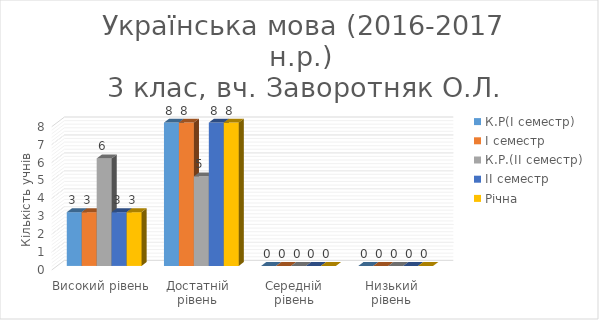
| Category | К.Р(І семестр) | І семестр | К.Р.(ІІ семестр) | ІІ семестр | Річна |
|---|---|---|---|---|---|
| Високий рівень | 3 | 3 | 6 | 3 | 3 |
| Достатній рівень | 8 | 8 | 5 | 8 | 8 |
| Середній рівень | 0 | 0 | 0 | 0 | 0 |
| Низький рівень | 0 | 0 | 0 | 0 | 0 |